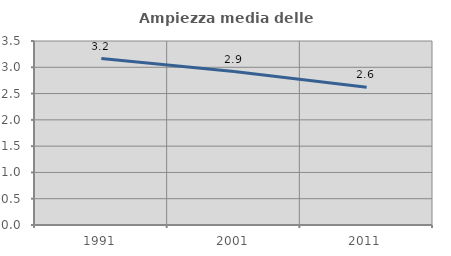
| Category | Ampiezza media delle famiglie |
|---|---|
| 1991.0 | 3.166 |
| 2001.0 | 2.918 |
| 2011.0 | 2.622 |